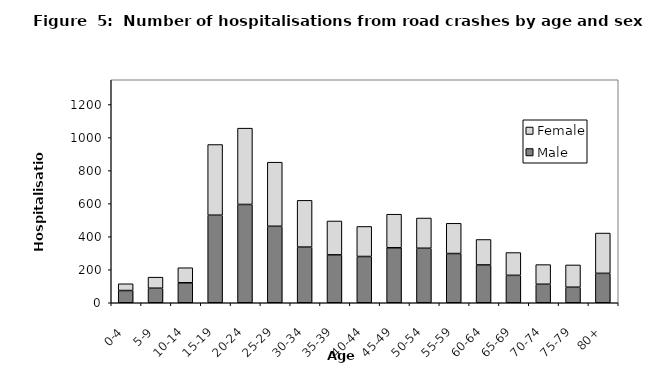
| Category | Male | Female |
|---|---|---|
| 0-4 | 74 | 41 |
| 5-9 | 88 | 67 |
| 10-14 | 121 | 91 |
| 15-19 | 530 | 428 |
| 20-24 | 595 | 462 |
| 25-29 | 463 | 388 |
| 30-34 | 337 | 283 |
| 35-39 | 290 | 205 |
| 40-44 | 280 | 182 |
| 45-49 | 333 | 203 |
| 50-54 | 330 | 183 |
| 55-59 | 298 | 183 |
| 60-64 | 229 | 154 |
| 65-69 | 166 | 138 |
| 70-74 | 112 | 119 |
| 75-79 | 94 | 135 |
| 80+ | 178 | 244 |